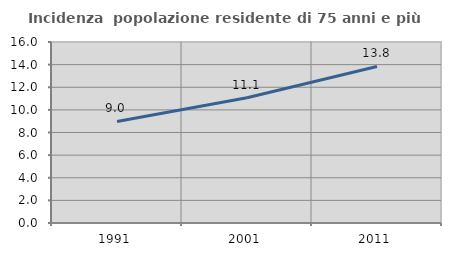
| Category | Incidenza  popolazione residente di 75 anni e più |
|---|---|
| 1991.0 | 8.977 |
| 2001.0 | 11.067 |
| 2011.0 | 13.837 |